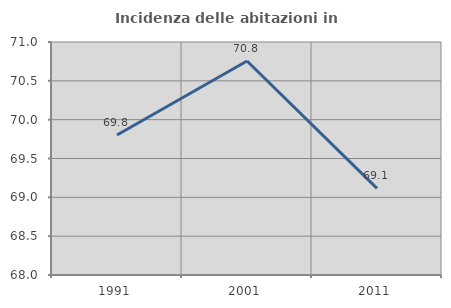
| Category | Incidenza delle abitazioni in proprietà  |
|---|---|
| 1991.0 | 69.802 |
| 2001.0 | 70.755 |
| 2011.0 | 69.114 |